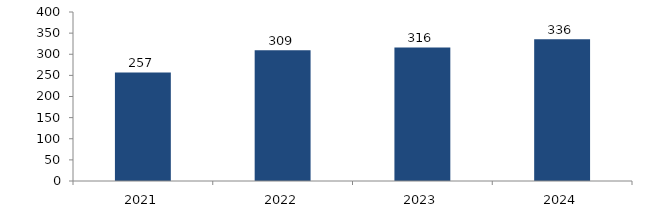
| Category | Bogotá |
|---|---|
| 2021.0 | 257.033 |
| 2022.0 | 309.26 |
| 2023.0 | 316.038 |
| 2024.0 | 335.533 |